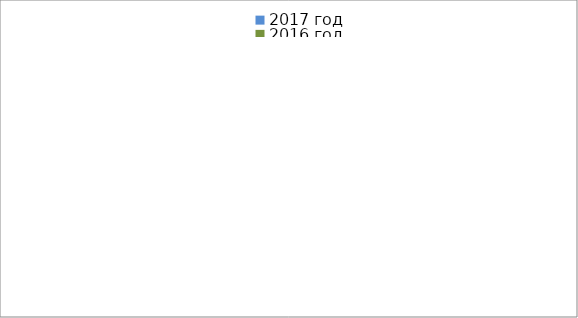
| Category | 2017 год | 2016 год |
|---|---|---|
|  - поджог | 15 | 39 |
|  - неосторожное обращение с огнём | 6 | 22 |
|  - НПТЭ электрооборудования | 19 | 18 |
|  - НПУ и Э печей | 46 | 31 |
|  - НПУ и Э транспортных средств | 45 | 29 |
|   -Шалость с огнем детей | 3 | 6 |
|  -НППБ при эксплуатации эл.приборов | 24 | 13 |
|  - курение | 34 | 18 |
| - прочие | 73 | 89 |
| - не установленные причины | 0 | 12 |